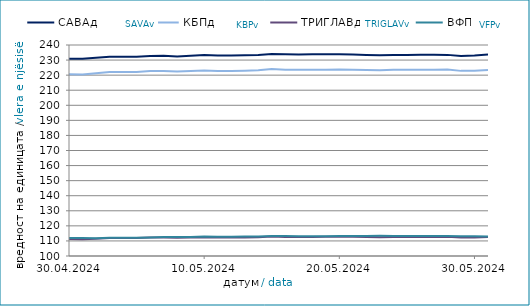
| Category | САВАд | КБПд | ТРИГЛАВд | ВФПд |
|---|---|---|---|---|
| 2024-04-30 | 230.899 | 220.641 | 111.26 | 111.978 |
| 2024-05-01 | 230.81 | 220.494 | 111.192 | 111.901 |
| 2024-05-02 | 231.566 | 221.24 | 111.499 | 111.763 |
| 2024-05-03 | 232.201 | 222.065 | 111.896 | 112.115 |
| 2024-05-04 | 232.213 | 222.075 | 111.902 | 112.122 |
| 2024-05-05 | 232.225 | 222.086 | 111.908 | 112.129 |
| 2024-05-06 | 232.746 | 222.699 | 112.194 | 112.31 |
| 2024-05-07 | 232.895 | 222.796 | 112.259 | 112.603 |
| 2024-05-08 | 232.431 | 222.363 | 112.079 | 112.564 |
| 2024-05-09 | 232.869 | 222.742 | 112.288 | 112.639 |
| 2024-05-10 | 233.297 | 223.067 | 112.441 | 112.871 |
| 2024-05-11 | 233.059 | 222.808 | 112.318 | 112.842 |
| 2024-05-12 | 233.071 | 222.819 | 112.324 | 112.849 |
| 2024-05-13 | 233.127 | 222.926 | 112.345 | 112.897 |
| 2024-05-14 | 233.376 | 223.222 | 112.482 | 112.919 |
| 2024-05-15 | 234.001 | 223.995 | 112.86 | 113.207 |
| 2024-05-16 | 233.801 | 223.591 | 112.669 | 113.253 |
| 2024-05-17 | 233.684 | 223.51 | 112.621 | 113.114 |
| 2024-05-18 | 233.803 | 223.641 | 112.689 | 113.137 |
| 2024-05-19 | 233.815 | 223.652 | 112.695 | 113.144 |
| 2024-05-20 | 233.88 | 223.778 | 112.736 | 113.318 |
| 2024-05-21 | 233.688 | 223.641 | 112.72 | 113.213 |
| 2024-05-22 | 233.401 | 223.395 | 112.582 | 113.307 |
| 2024-05-23 | 233.193 | 223.258 | 112.458 | 113.388 |
| 2024-05-24 | 233.428 | 223.53 | 112.62 | 113.272 |
| 2024-05-25 | 233.44 | 223.54 | 112.626 | 113.279 |
| 2024-05-26 | 233.453 | 223.551 | 112.632 | 113.286 |
| 2024-05-27 | 233.483 | 223.586 | 112.646 | 113.341 |
| 2024-05-28 | 233.446 | 223.708 | 112.695 | 113.291 |
| 2024-05-29 | 232.631 | 222.834 | 112.285 | 113.17 |
| 2024-05-30 | 233.038 | 222.84 | 112.298 | 113.159 |
| 2024-05-31 | 233.693 | 223.385 | 112.668 | 113.01 |